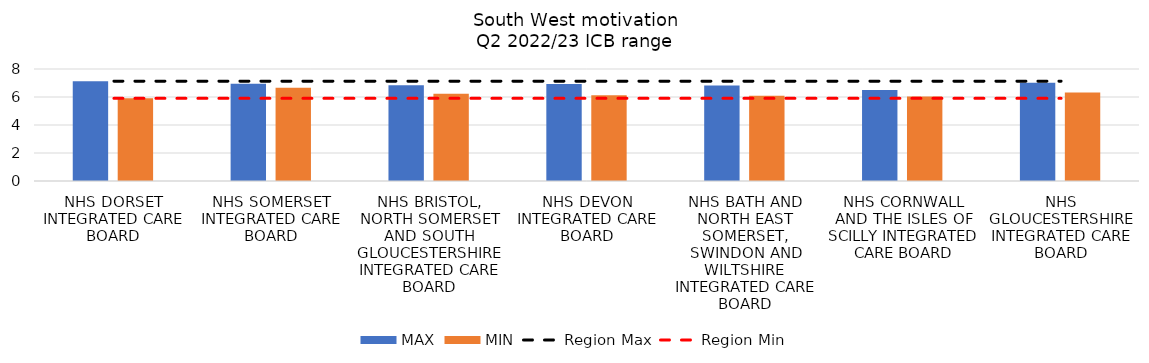
| Category | MAX | MIN |
|---|---|---|
| NHS DORSET INTEGRATED CARE BOARD | 7.132 | 5.903 |
| NHS SOMERSET INTEGRATED CARE BOARD | 6.948 | 6.663 |
| NHS BRISTOL, NORTH SOMERSET AND SOUTH GLOUCESTERSHIRE INTEGRATED CARE BOARD | 6.837 | 6.229 |
| NHS DEVON INTEGRATED CARE BOARD | 6.933 | 6.12 |
| NHS BATH AND NORTH EAST SOMERSET, SWINDON AND WILTSHIRE INTEGRATED CARE BOARD | 6.822 | 6.098 |
| NHS CORNWALL AND THE ISLES OF SCILLY INTEGRATED CARE BOARD | 6.5 | 6.042 |
| NHS GLOUCESTERSHIRE INTEGRATED CARE BOARD | 7.017 | 6.32 |